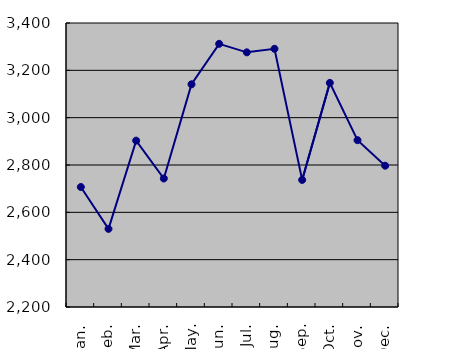
| Category | Series 0 |
|---|---|
| Jan. | 2707 |
| Feb. | 2530 |
| Mar. | 2903 |
| Apr. | 2743 |
| May. | 3141 |
| Jun. | 3312 |
| Jul. | 3276 |
| Aug. | 3291 |
| Sep. | 2737 |
| Oct. | 3147 |
| Nov. | 2905 |
| Dec. | 2797 |